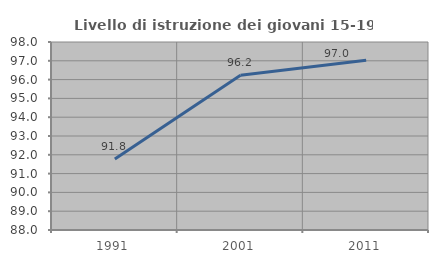
| Category | Livello di istruzione dei giovani 15-19 anni |
|---|---|
| 1991.0 | 91.781 |
| 2001.0 | 96.234 |
| 2011.0 | 97.034 |